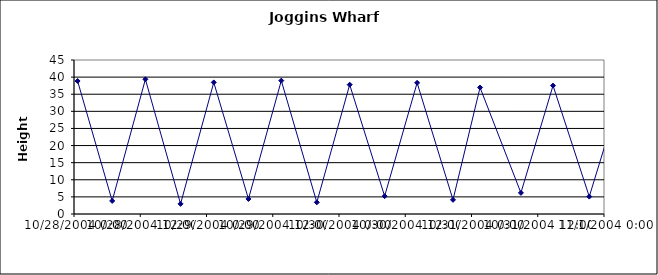
| Category | Height |
|---|---|
| 38288.027083333334 | 38.86 |
| 38288.288194444445 | 3.82 |
| 38288.53888888889 | 39.37 |
| 38288.80416666667 | 2.96 |
| 38289.05486111111 | 38.45 |
| 38289.316666666666 | 4.4 |
| 38289.56458333333 | 38.97 |
| 38289.83263888889 | 3.41 |
| 38290.080555555556 | 37.79 |
| 38290.34444444445 | 5.22 |
| 38290.589583333334 | 38.33 |
| 38290.86041666667 | 4.15 |
| 38291.06458333333 | 36.96 |
| 38291.37291666667 | 6.18 |
| 38291.615277777775 | 37.52 |
| 38291.88888888889 | 5.09 |
| 38292.13333333333 | 36.03 |